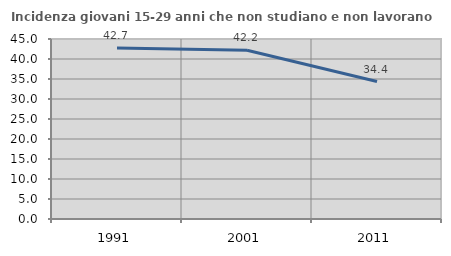
| Category | Incidenza giovani 15-29 anni che non studiano e non lavorano  |
|---|---|
| 1991.0 | 42.742 |
| 2001.0 | 42.204 |
| 2011.0 | 34.356 |